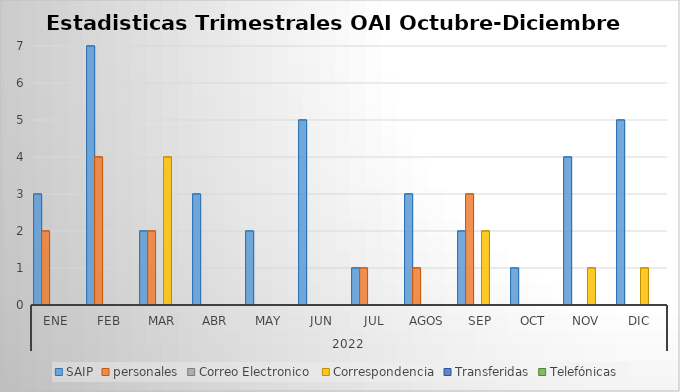
| Category | SAIP | personales | Correo Electronico  | Correspondencia | Transferidas | Telefónicas |
|---|---|---|---|---|---|---|
| 0 | 3 | 2 | 0 | 0 | 0 | 0 |
| 1 | 7 | 4 | 0 | 0 | 0 | 0 |
| 2 | 2 | 2 | 0 | 4 | 0 | 0 |
| 3 | 3 | 0 | 0 | 0 | 0 | 0 |
| 4 | 2 | 0 | 0 | 0 | 0 | 0 |
| 5 | 5 | 0 | 0 | 0 | 0 | 0 |
| 6 | 1 | 1 | 0 | 0 | 0 | 0 |
| 7 | 3 | 1 | 0 | 0 | 0 | 0 |
| 8 | 2 | 3 | 0 | 2 | 0 | 0 |
| 9 | 1 | 0 | 0 | 0 | 0 | 0 |
| 10 | 4 | 0 | 0 | 1 | 0 | 0 |
| 11 | 5 | 0 | 0 | 1 | 0 | 0 |